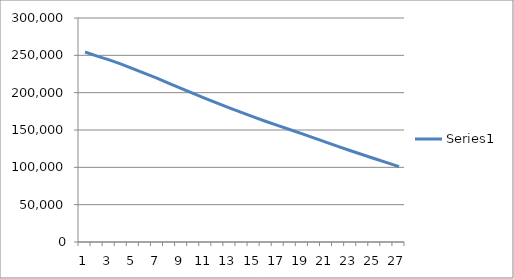
| Category | Series 0 |
|---|---|
| 0 | 254455.462 |
| 1 | 248948.379 |
| 2 | 243949.589 |
| 3 | 238283.835 |
| 4 | 231867.853 |
| 5 | 225573.598 |
| 6 | 219123.538 |
| 7 | 212127.953 |
| 8 | 205429.936 |
| 9 | 198741.478 |
| 10 | 192068.669 |
| 11 | 185571.221 |
| 12 | 179307.795 |
| 13 | 173138.778 |
| 14 | 167187.031 |
| 15 | 161432.744 |
| 16 | 155865.006 |
| 17 | 150341.12 |
| 18 | 144896.532 |
| 19 | 139163.772 |
| 20 | 133412.658 |
| 21 | 127743.415 |
| 22 | 122255.443 |
| 23 | 116859.464 |
| 24 | 111459.54 |
| 25 | 106226.164 |
| 26 | 101043.675 |